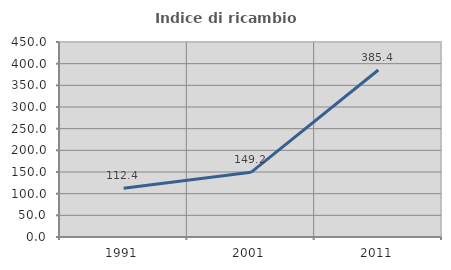
| Category | Indice di ricambio occupazionale  |
|---|---|
| 1991.0 | 112.36 |
| 2001.0 | 149.206 |
| 2011.0 | 385.417 |